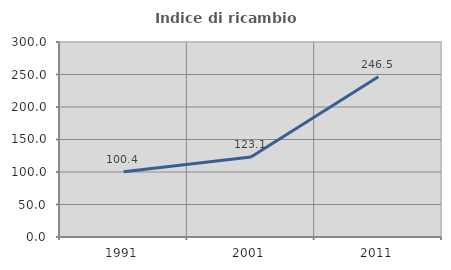
| Category | Indice di ricambio occupazionale  |
|---|---|
| 1991.0 | 100.386 |
| 2001.0 | 123.109 |
| 2011.0 | 246.497 |